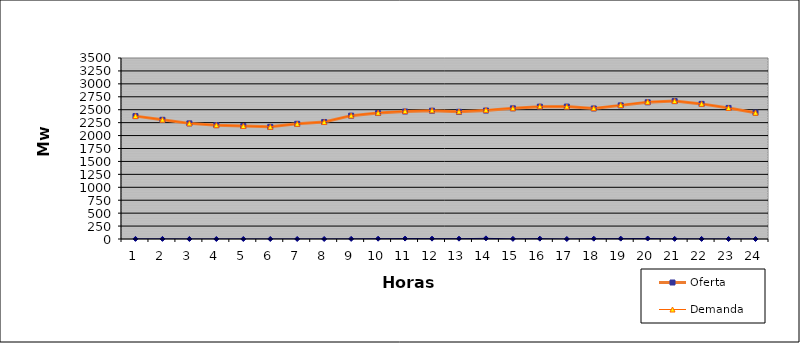
| Category | Oferta | Demanda | No Servida |
|---|---|---|---|
| 1.0 | 2376.24 | 2378.24 | 2 |
| 2.0 | 2305.03 | 2307.03 | 2 |
| 3.0 | 2235.82 | 2235.82 | 0 |
| 4.0 | 2201.25 | 2201.25 | 0 |
| 5.0 | 2185 | 2185.25 | 0.25 |
| 6.0 | 2168.56 | 2168.8 | 0.24 |
| 7.0 | 2227.32 | 2227.56 | 0.24 |
| 8.0 | 2262.89 | 2263.13 | 0.24 |
| 9.0 | 2385.35 | 2387.71 | 2.36 |
| 10.0 | 2435.67 | 2441.44 | 5.77 |
| 11.0 | 2465.71 | 2474.02 | 8.31 |
| 12.0 | 2480.88 | 2487.69 | 6.81 |
| 13.0 | 2459.77 | 2465.96 | 6.19 |
| 14.0 | 2483.78 | 2496.31 | 12.53 |
| 15.0 | 2526.79 | 2529.48 | 2.69 |
| 16.0 | 2559.25 | 2565.62 | 6.37 |
| 17.0 | 2560.68 | 2560.68 | 0 |
| 18.0 | 2524.23 | 2530.242 | 6.012 |
| 19.0 | 2583.82 | 2590.5 | 6.68 |
| 20.0 | 2643.22 | 2652.48 | 9.26 |
| 21.0 | 2666.11 | 2668.65 | 2.54 |
| 22.0 | 2612.64 | 2614.16 | 1.52 |
| 23.0 | 2534.14 | 2534.14 | 0 |
| 24.0 | 2442.07 | 2442.07 | 0 |